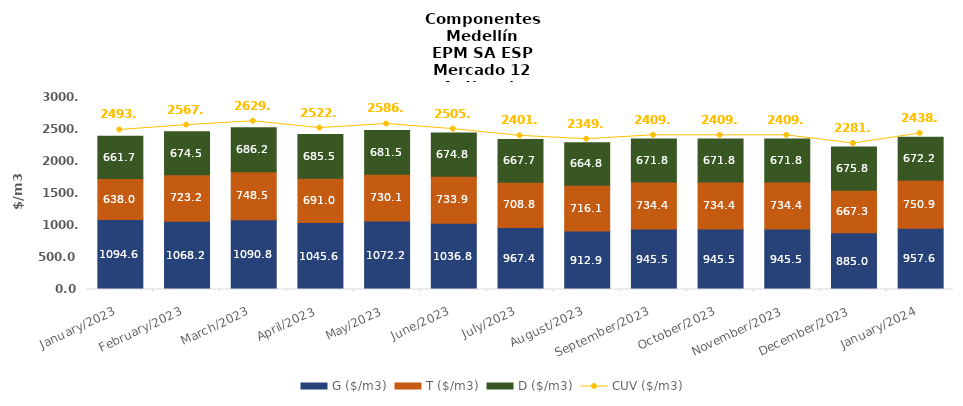
| Category | G ($/m3) | T ($/m3) | D ($/m3) |
|---|---|---|---|
| 2023-01-01 | 1094.64 | 637.95 | 661.67 |
| 2023-02-01 | 1068.19 | 723.22 | 674.52 |
| 2023-03-01 | 1090.77 | 748.48 | 686.22 |
| 2023-04-01 | 1045.58 | 690.98 | 685.49 |
| 2023-05-01 | 1072.19 | 730.14 | 681.45 |
| 2023-06-01 | 1036.8 | 733.9 | 674.81 |
| 2023-07-01 | 967.35 | 708.84 | 667.66 |
| 2023-08-01 | 912.93 | 716.07 | 664.76 |
| 2023-09-01 | 945.5 | 734.35 | 671.79 |
| 2023-10-01 | 945.5 | 734.35 | 671.79 |
| 2023-11-01 | 945.5 | 734.35 | 671.79 |
| 2023-12-01 | 884.98 | 667.31 | 675.79 |
| 2024-01-01 | 957.58 | 750.85 | 672.19 |